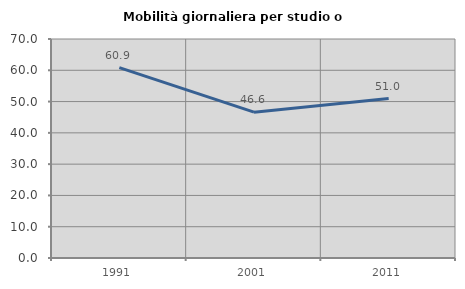
| Category | Mobilità giornaliera per studio o lavoro |
|---|---|
| 1991.0 | 60.87 |
| 2001.0 | 46.61 |
| 2011.0 | 50.98 |